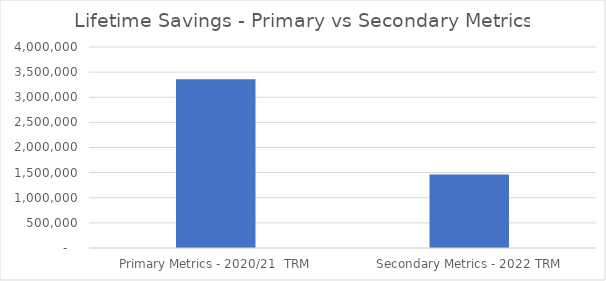
| Category | Series 0 |
|---|---|
| Primary Metrics - 2020/21  TRM | 3360667.619 |
| Secondary Metrics - 2022 TRM | 1461054.416 |